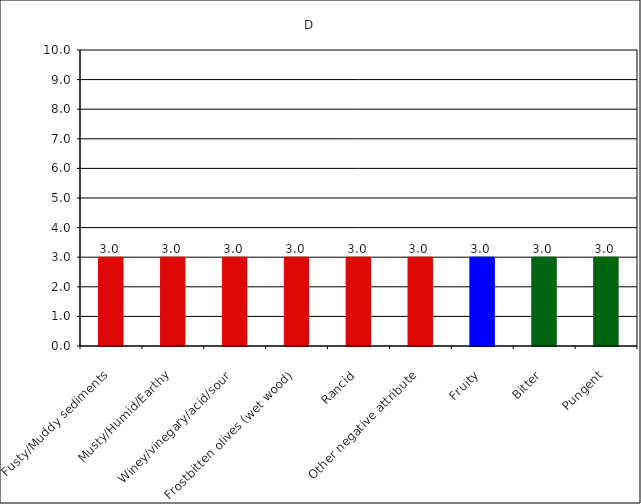
| Category | D |
|---|---|
| Fusty/Muddy sediments | 3 |
| Musty/Humid/Earthy | 3 |
| Winey/vinegary/acid/sour | 3 |
| Frostbitten olives (wet wood) | 3 |
| Rancid | 3 |
| Other negative attribute | 3 |
| Fruity | 3 |
| Bitter | 3 |
| Pungent | 3 |